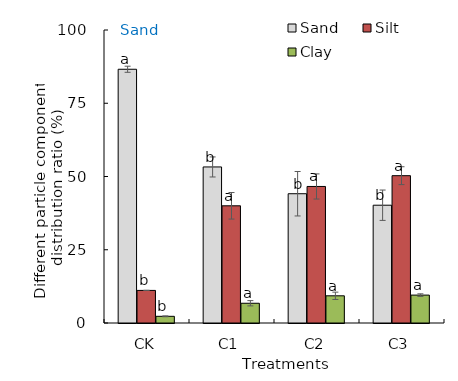
| Category | Sand | Silt | Clay |
|---|---|---|---|
| CK | 86.6 | 11.12 | 2.28 |
| C1 | 53.26 | 40 | 6.74 |
| C2 | 44.12 | 46.6 | 9.28 |
| C3 | 40.2 | 50.28 | 9.52 |